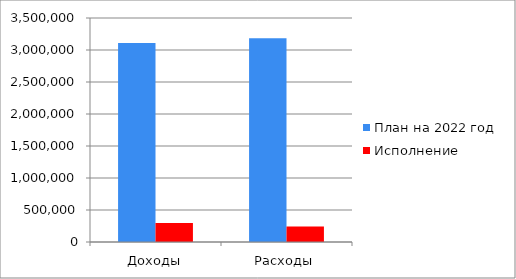
| Category | План на 2022 год | Исполнение |
|---|---|---|
| Доходы | 3110102.237 | 295462.596 |
| Расходы | 3184127.369 | 242942.72 |